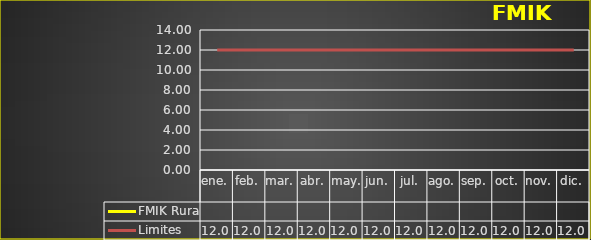
| Category | FMIK Rura | Limites |
|---|---|---|
| ene. |  | 12 |
| feb. |  | 12 |
| mar. |  | 12 |
| abr. |  | 12 |
| may. |  | 12 |
| jun. |  | 12 |
| jul. |  | 12 |
| ago. |  | 12 |
| sep. |  | 12 |
| oct. |  | 12 |
| nov. |  | 12 |
| dic. |  | 12 |